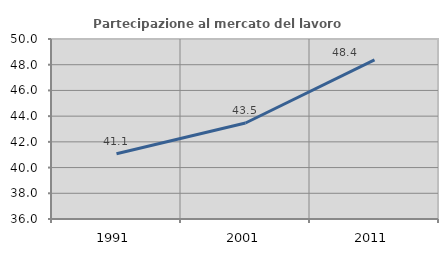
| Category | Partecipazione al mercato del lavoro  femminile |
|---|---|
| 1991.0 | 41.078 |
| 2001.0 | 43.468 |
| 2011.0 | 48.382 |